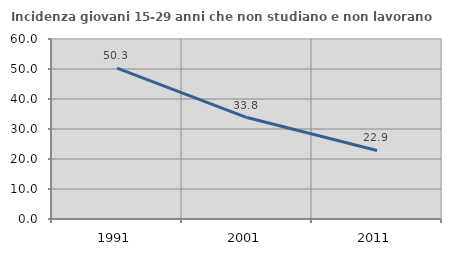
| Category | Incidenza giovani 15-29 anni che non studiano e non lavorano  |
|---|---|
| 1991.0 | 50.262 |
| 2001.0 | 33.824 |
| 2011.0 | 22.857 |